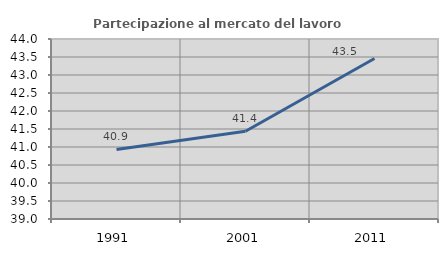
| Category | Partecipazione al mercato del lavoro  femminile |
|---|---|
| 1991.0 | 40.932 |
| 2001.0 | 41.439 |
| 2011.0 | 43.459 |